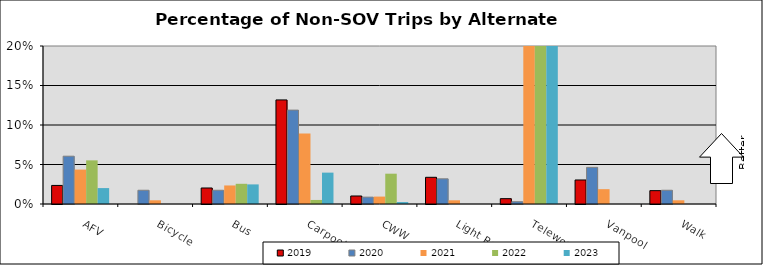
| Category | 2019 | 2020 | 2021 | 2022 | 2023 |
|---|---|---|---|---|---|
| AFV | 0.024 | 0.061 | 0.044 | 0.055 | 0.02 |
| Bicycle | 0 | 0.017 | 0.005 | 0 | 0 |
| Bus | 0.02 | 0.017 | 0.023 | 0.026 | 0.025 |
| Carpool | 0.132 | 0.119 | 0.089 | 0.005 | 0.04 |
| CWW | 0.01 | 0.009 | 0.009 | 0.038 | 0.002 |
| Light Rail | 0.034 | 0.032 | 0.005 | 0 | 0 |
| Telework | 0.007 | 0.003 | 0.254 | 0.302 | 0.208 |
| Vanpool | 0.03 | 0.046 | 0.019 | 0 | 0 |
| Walk | 0.017 | 0.017 | 0.005 | 0 | 0 |